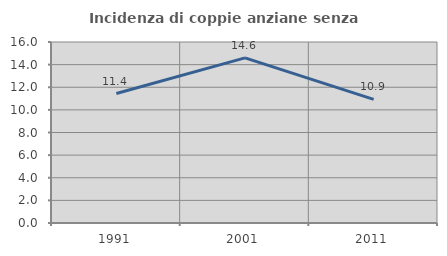
| Category | Incidenza di coppie anziane senza figli  |
|---|---|
| 1991.0 | 11.446 |
| 2001.0 | 14.599 |
| 2011.0 | 10.924 |